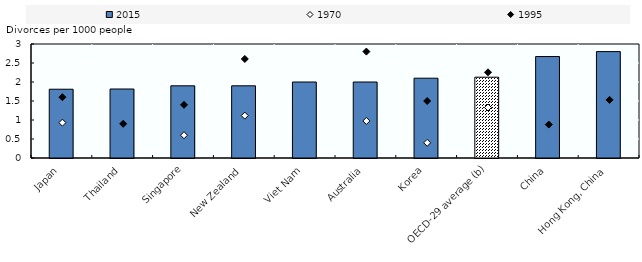
| Category | 2015 |
|---|---|
| Japan | 1.81 |
| Thailand | 1.815 |
| Singapore | 1.9 |
| New Zealand | 1.9 |
| Viet Nam | 2 |
| Australia | 2 |
| Korea | 2.1 |
| OECD-29 average (b) | 2.127 |
| China | 2.67 |
| Hong Kong, China | 2.8 |